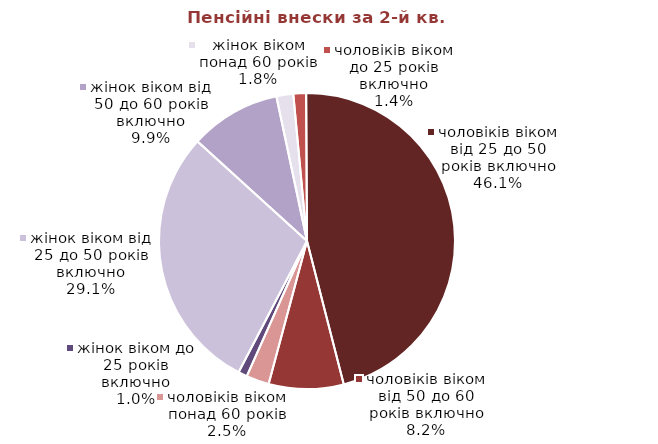
| Category | Series 0 |
|---|---|
| жінок віком до 25 років включно | 0.739 |
| жінок віком від 25 до 50 років включно | 21.987 |
| жінок віком від 50 до 60 років включно | 7.5 |
| жінок віком понад 60 років | 1.391 |
| чоловіків віком до 25 років включно | 1.05 |
| чоловіків віком від 25 до 50 років включно | 34.823 |
| чоловіків віком від 50 до 60 років включно | 6.17 |
| чоловіків віком понад 60 років | 1.883 |